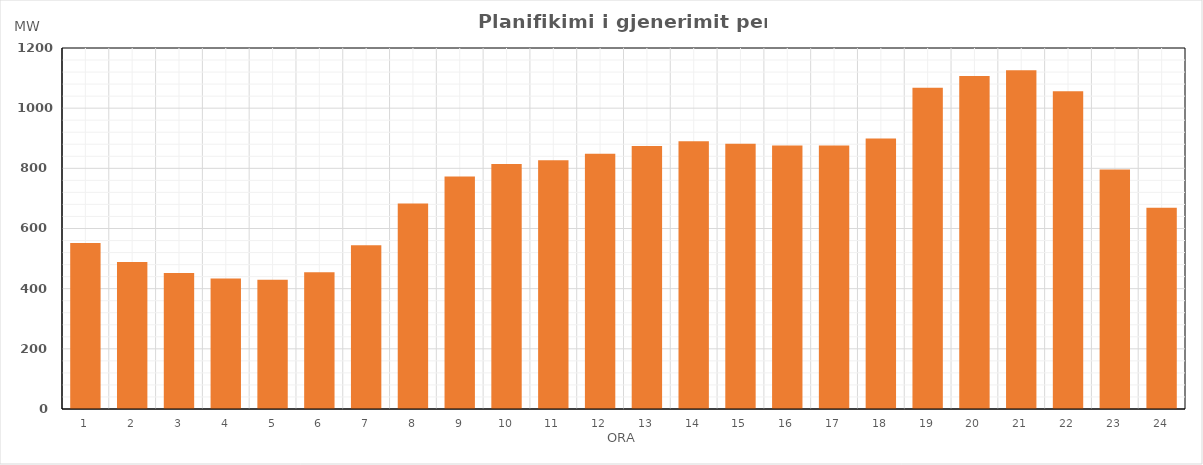
| Category | Max (MW) |
|---|---|
| 0 | 552.18 |
| 1 | 488.34 |
| 2 | 451.72 |
| 3 | 433.92 |
| 4 | 429.41 |
| 5 | 454.72 |
| 6 | 544.28 |
| 7 | 682.89 |
| 8 | 772.79 |
| 9 | 814.26 |
| 10 | 826.46 |
| 11 | 848.2 |
| 12 | 874.1 |
| 13 | 890.12 |
| 14 | 881.33 |
| 15 | 876.02 |
| 16 | 876.01 |
| 17 | 899.23 |
| 18 | 1068.13 |
| 19 | 1106.67 |
| 20 | 1125.82 |
| 21 | 1056.6 |
| 22 | 796.11 |
| 23 | 669.26 |